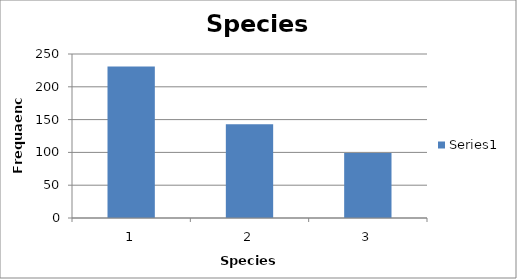
| Category | Series 0 |
|---|---|
| 1.0 | 231 |
| 2.0 | 143 |
| 3.0 | 99 |